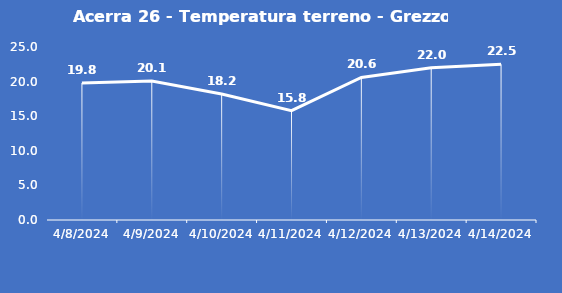
| Category | Acerra 26 - Temperatura terreno - Grezzo (°C) |
|---|---|
| 4/8/24 | 19.8 |
| 4/9/24 | 20.1 |
| 4/10/24 | 18.2 |
| 4/11/24 | 15.8 |
| 4/12/24 | 20.6 |
| 4/13/24 | 22 |
| 4/14/24 | 22.5 |